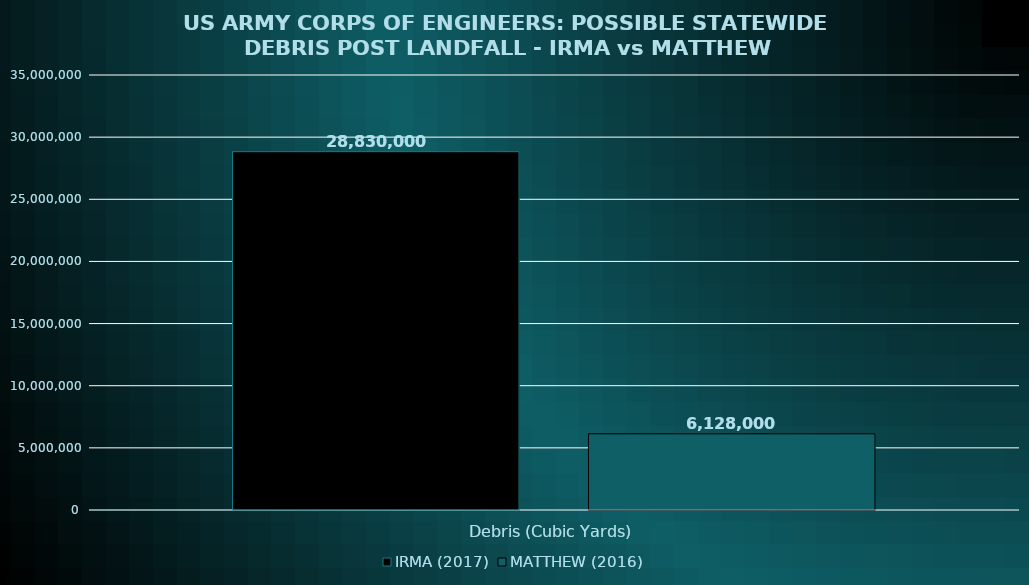
| Category | IRMA (2017) | MATTHEW (2016) |
|---|---|---|
| Debris (Cubic Yards) | 28830000 | 6128000 |